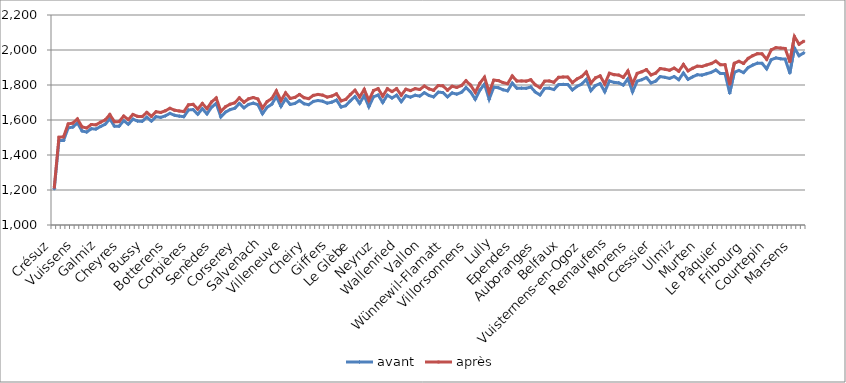
| Category | avant | après |
|---|---|---|
| Crésuz | 1207.476 | 1216.159 |
| Delley-Portalban | 1482.357 | 1501.387 |
| Plasselb | 1483.153 | 1503.768 |
| Rueyres-les-Prés | 1555.033 | 1577.546 |
| Châtillon | 1559.612 | 1582.291 |
| Vuissens | 1583.026 | 1605.901 |
| Kleinbösingen | 1537.22 | 1560.422 |
| Courlevon | 1531.126 | 1554.497 |
| Châtel-sur-Montsalvens | 1550.034 | 1574.265 |
| Rechthalten | 1548.239 | 1572.543 |
| Galmiz | 1562.953 | 1587.54 |
| Bas-Intyamon | 1575.868 | 1600.468 |
| Gletterens | 1606.046 | 1630.976 |
| St. Silvester | 1564.75 | 1590.142 |
| St. Antoni | 1564.538 | 1590.832 |
| Cheyres | 1595.908 | 1622.36 |
| Plaffeien | 1575.894 | 1602.713 |
| Léchelles | 1604.751 | 1631.632 |
| Ueberstorf | 1593.825 | 1620.809 |
| Greng | 1592.405 | 1619.493 |
| Bussy | 1615.795 | 1643.255 |
| Haut-Intyamon | 1593.511 | 1621.189 |
| Les Montets | 1619.124 | 1647.101 |
| Chésopelloz | 1614.766 | 1643.181 |
| Val-de-Charmey | 1623.734 | 1652.502 |
| Botterens | 1637.948 | 1666.959 |
| Brünisried | 1626.867 | 1655.899 |
| Hauteville | 1622.287 | 1651.6 |
| Russy | 1618.799 | 1648.2 |
| Semsales | 1657.058 | 1686.526 |
| Corbières | 1659.865 | 1689.509 |
| Arconciel | 1632.877 | 1662.543 |
| Grandvillard | 1664.376 | 1694.363 |
| Haut-Vully | 1635.021 | 1665.182 |
| Rue | 1672.95 | 1703.328 |
| Senèdes | 1695.171 | 1725.759 |
| Montet (Glâne) | 1618.263 | 1648.883 |
| Alterswil | 1644.704 | 1675.439 |
| Heitenried | 1659.351 | 1690.167 |
| Torny | 1666.894 | 1697.885 |
| Corserey | 1694.408 | 1726.363 |
| Düdingen | 1669.561 | 1701.554 |
| Grangettes | 1688.859 | 1720.896 |
| Misery-Courtion | 1696.265 | 1728.474 |
| Ferpicloz | 1687.611 | 1719.931 |
| Salvenach | 1636.051 | 1668.607 |
| Barberêche | 1672.55 | 1705.428 |
| Autigny | 1689.561 | 1722.477 |
| Dompierre | 1733.041 | 1766.311 |
| Muntelier | 1677.675 | 1711.061 |
| Villeneuve | 1720.91 | 1754.916 |
| La Folliaz | 1688.849 | 1723.203 |
| Pont-en-Ogoz | 1694.471 | 1729.004 |
| Sorens | 1711.134 | 1745.746 |
| St. Ursen | 1692.788 | 1727.403 |
| Cheiry | 1687.448 | 1722.088 |
| Ponthaux | 1706.001 | 1740.697 |
| Chapelle (Glâne) | 1711.362 | 1746.136 |
| Riaz | 1707.26 | 1742.161 |
| Surpierre | 1695.987 | 1730.898 |
| Giffers | 1701.928 | 1736.888 |
| Ried bei Kerzers | 1714.157 | 1749.191 |
| Bösingen | 1673.955 | 1709.149 |
| Gempenach | 1681.948 | 1717.485 |
| Tentlingen | 1709.833 | 1745.812 |
| Le Glèbe | 1733.969 | 1769.975 |
| Ecublens | 1695.154 | 1731.202 |
| Saint-Aubin | 1738.701 | 1774.863 |
| Massonnens | 1675.94 | 1712.105 |
| Villarepos | 1732.346 | 1768.55 |
| Neyruz | 1742.502 | 1778.939 |
| Pierrafortscha | 1700.099 | 1736.663 |
| Prez-vers-Noréaz | 1741.864 | 1778.483 |
| Autafond | 1725.671 | 1762.468 |
| Châbles | 1741.864 | 1778.801 |
| Wallenried | 1704.817 | 1741.934 |
| Cugy | 1738.819 | 1775.946 |
| Corpataux-Magnedens | 1730.381 | 1767.866 |
| Montagny | 1741.417 | 1779.076 |
| Bas-Vully | 1736.706 | 1774.393 |
| Vallon | 1756.129 | 1793.971 |
| Gurmels | 1739.905 | 1777.75 |
| La Brillaz | 1732.038 | 1769.907 |
| Tafers | 1759.039 | 1797.072 |
| Châtel-Saint-Denis | 1756.928 | 1795.06 |
| Wünnewil-Flamatt | 1732.21 | 1770.367 |
| Murist | 1754.716 | 1792.952 |
| Pont-la-Ville | 1747.708 | 1786.518 |
| Schmitten | 1757.661 | 1796.594 |
| Gruyères | 1785.137 | 1824.276 |
| Villorsonnens | 1759.591 | 1798.987 |
| Morlon | 1718.499 | 1758.007 |
| Le Châtelard | 1770.869 | 1810.708 |
| Granges-Paccot | 1804.624 | 1844.628 |
| Villarsel-sur-Marly | 1718.63 | 1758.656 |
| Lully | 1787.331 | 1827.637 |
| Chénens | 1784.486 | 1825.224 |
| Givisiez | 1772.82 | 1813.647 |
| Vaulruz | 1766.588 | 1807.676 |
| Villaz-Saint-Pierre | 1810.362 | 1851.511 |
| Ependes | 1781.362 | 1822.555 |
| Hauterive | 1782.025 | 1823.231 |
| Le Mouret | 1780.831 | 1822.038 |
| Courgevaux | 1788.698 | 1829.91 |
| La Roche | 1759.295 | 1800.522 |
| Auboranges | 1743.248 | 1784.479 |
| Echarlens | 1780.5 | 1821.931 |
| Marly | 1781.604 | 1823.119 |
| Corminboeuf | 1773.943 | 1815.752 |
| Broc | 1801.939 | 1843.787 |
| Belfaux | 1803.623 | 1845.559 |
| Noréaz | 1802.969 | 1845.017 |
| Lurtigen | 1771.729 | 1813.786 |
| La Verrerie | 1792.174 | 1834.394 |
| Avry | 1805.256 | 1848.115 |
| Vuisternens-en-Ogoz | 1831.12 | 1874.262 |
| Jaun | 1767.737 | 1811.352 |
| Siviriez | 1797.028 | 1840.909 |
| Fétigny | 1808.165 | 1852.051 |
| Fräschels | 1761.58 | 1805.689 |
| Remaufens | 1822.904 | 1867.081 |
| Saint-Martin | 1814.852 | 1859.092 |
| Kerzers | 1812.508 | 1856.8 |
| Mézières | 1799.444 | 1843.987 |
| Grolley | 1835.597 | 1880.183 |
| Morens | 1761.353 | 1806.332 |
| Vernay | 1821.322 | 1866.363 |
| Le Flon | 1830.344 | 1875.578 |
| Bulle | 1842.374 | 1887.793 |
| La Sonnaz | 1811.734 | 1857.425 |
| Cressier | 1821.774 | 1867.771 |
| Ursy | 1848.044 | 1894.18 |
| Vuisternens-devant-Romont | 1843.714 | 1889.912 |
| Ménières | 1837.66 | 1884.503 |
| Nuvilly | 1848.37 | 1896.604 |
| Ulmiz | 1830.363 | 1878.782 |
| Romont | 1868.714 | 1917.213 |
| Granges | 1832.128 | 1880.863 |
| Treyvaux | 1846.712 | 1895.725 |
| Bossonnens | 1858.716 | 1907.808 |
| Murten | 1856.419 | 1905.926 |
| Oberschrot | 1864.388 | 1914.34 |
| Sâles | 1871.859 | 1922.248 |
| Attalens | 1885.885 | 1936.36 |
| Farvagny | 1865.551 | 1916.066 |
| Le Pâquier | 1865.066 | 1915.756 |
| Zumholz | 1753.648 | 1805.242 |
| Cottens | 1872.546 | 1924.153 |
| Rossens | 1883.138 | 1935.393 |
| Jeuss | 1870.901 | 1923.292 |
| Fribourg | 1899.594 | 1952.289 |
| Estavayer-le-Lac | 1913.996 | 1967.705 |
| Vuadens | 1924.885 | 1978.823 |
| Domdidier | 1923.664 | 1977.775 |
| Châtonnaye | 1892.311 | 1946.957 |
| Courtepin | 1944.8 | 2001.101 |
| Villars-sur-Glâne | 1954.724 | 2013.313 |
| Matran | 1949.88 | 2011.153 |
| Meyriez | 1947.416 | 2008.702 |
| Sévaz | 1868.598 | 1932.548 |
| Marsens | 2011.615 | 2076.685 |
| Billens-Hennens | 1967.369 | 2033.095 |
| Prévondavaux | 1983.28 | 2049.79 |